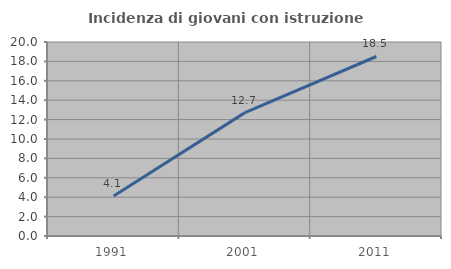
| Category | Incidenza di giovani con istruzione universitaria |
|---|---|
| 1991.0 | 4.124 |
| 2001.0 | 12.719 |
| 2011.0 | 18.505 |